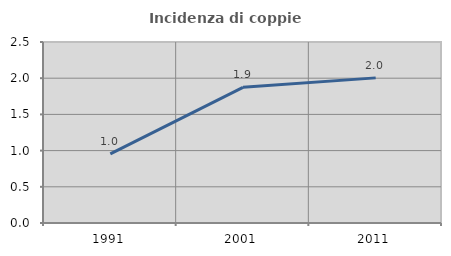
| Category | Incidenza di coppie miste |
|---|---|
| 1991.0 | 0.955 |
| 2001.0 | 1.874 |
| 2011.0 | 2.004 |